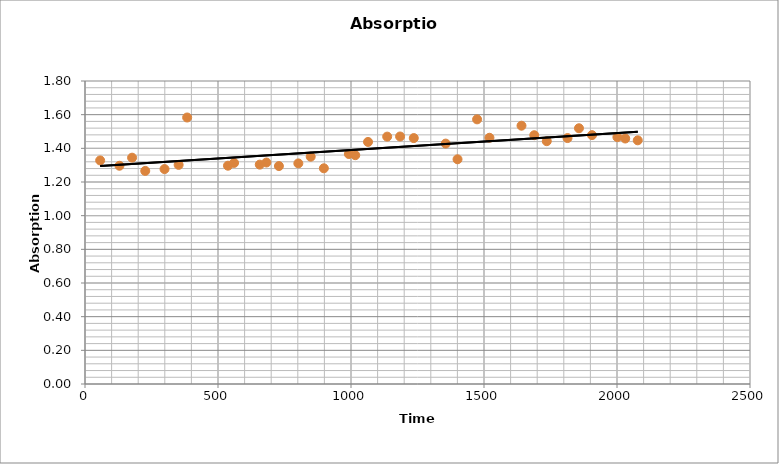
| Category | Absorption |
|---|---|
| 57.0 | 1.328 |
| 129.5 | 1.296 |
| 177.0 | 1.344 |
| 226.5 | 1.266 |
| 299.0 | 1.277 |
| 352.0 | 1.302 |
| 384.0 | 1.583 |
| 537.5 | 1.297 |
| 560.5 | 1.313 |
| 657.0 | 1.303 |
| 682.0 | 1.316 |
| 729.0 | 1.295 |
| 802.0 | 1.311 |
| 848.5 | 1.35 |
| 898.0 | 1.281 |
| 992.0 | 1.366 |
| 1016.0 | 1.359 |
| 1064.0 | 1.438 |
| 1136.0 | 1.47 |
| 1184.5 | 1.47 |
| 1236.0 | 1.461 |
| 1356.0 | 1.428 |
| 1400.5 | 1.335 |
| 1474.0 | 1.572 |
| 1520.5 | 1.463 |
| 1641.0 | 1.534 |
| 1689.0 | 1.478 |
| 1736.0 | 1.442 |
| 1814.0 | 1.461 |
| 1857.0 | 1.519 |
| 1906.0 | 1.478 |
| 2001.5 | 1.467 |
| 2031.0 | 1.458 |
| 2078.0 | 1.448 |